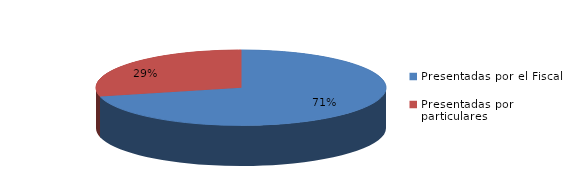
| Category | Series 0 |
|---|---|
| Presentadas por el Fiscal | 3335 |
| Presentadas por particulares | 1349 |